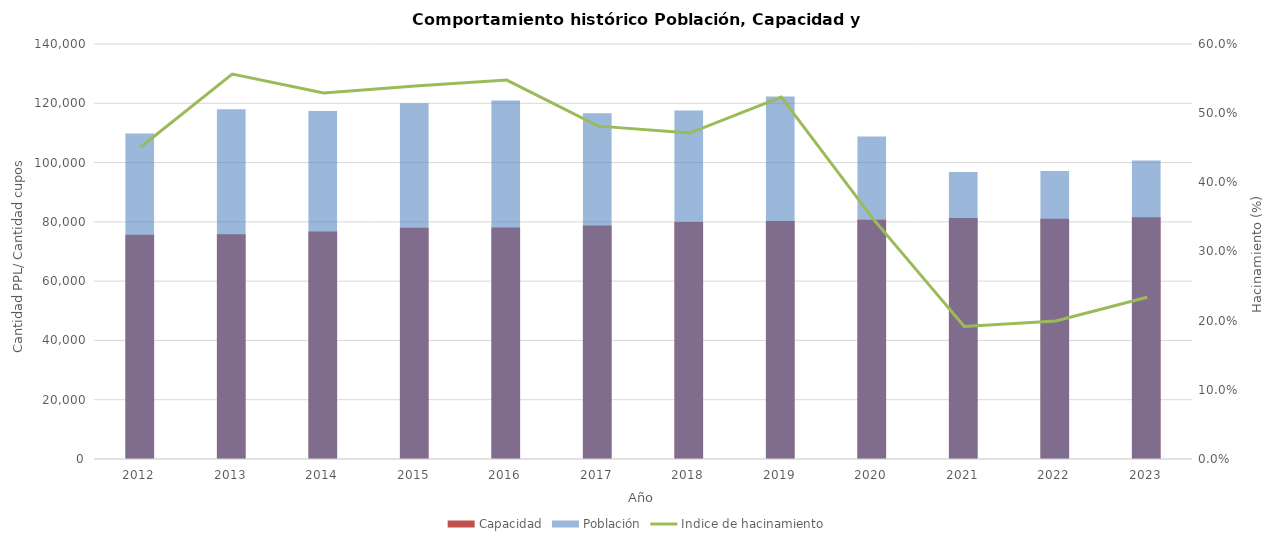
| Category | Capacidad | Población |
|---|---|---|
| 2012.0 | 75679.167 | 109822.083 |
| 2013.0 | 75796.583 | 117986.5 |
| 2014.0 | 76777 | 117389.083 |
| 2015.0 | 77979.75 | 120040.083 |
| 2016.0 | 78119.5 | 120914 |
| 2017.0 | 78759 | 116657.667 |
| 2018.0 | 79914 | 117569.583 |
| 2019.0 | 80296.167 | 122309.5 |
| 2020.0 | 80704.167 | 108777.75 |
| 2021.0 | 81268.833 | 96837.5 |
| 2022.0 | 81010.417 | 97175.917 |
| 2023.0 | 81580.727 | 100657.364 |